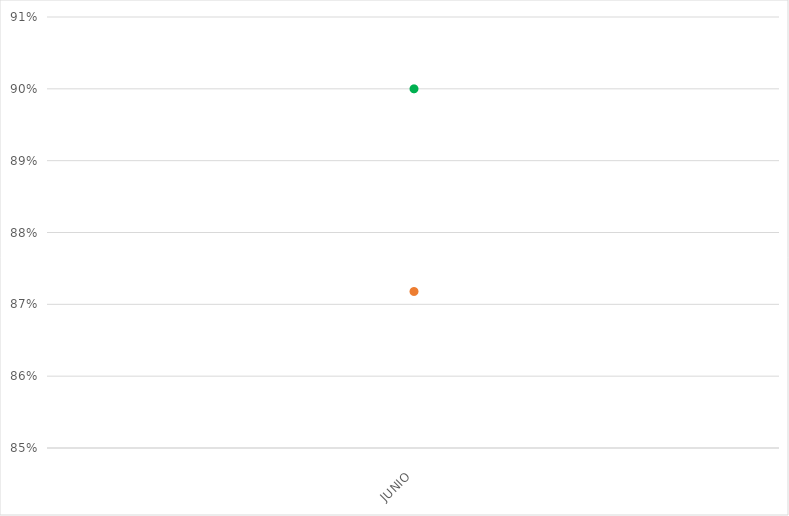
| Category | VALOR  | META PONDERADA |
|---|---|---|
| JUNIO | 0.872 | 0.9 |